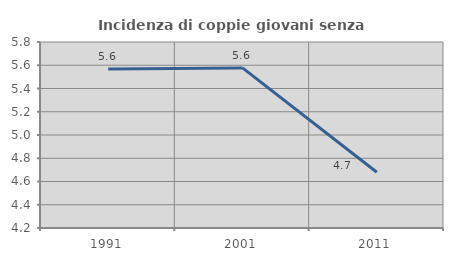
| Category | Incidenza di coppie giovani senza figli |
|---|---|
| 1991.0 | 5.568 |
| 2001.0 | 5.577 |
| 2011.0 | 4.68 |